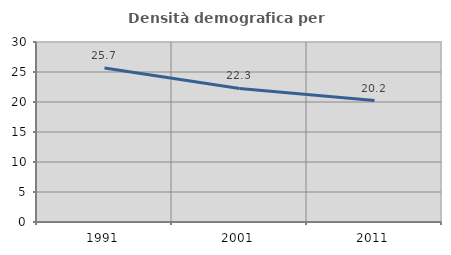
| Category | Densità demografica |
|---|---|
| 1991.0 | 25.659 |
| 2001.0 | 22.253 |
| 2011.0 | 20.239 |